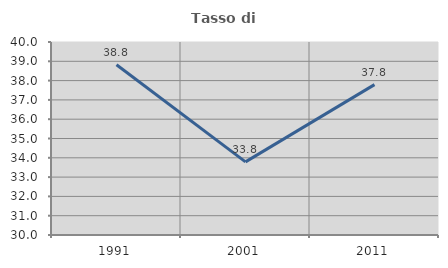
| Category | Tasso di occupazione   |
|---|---|
| 1991.0 | 38.818 |
| 2001.0 | 33.788 |
| 2011.0 | 37.792 |